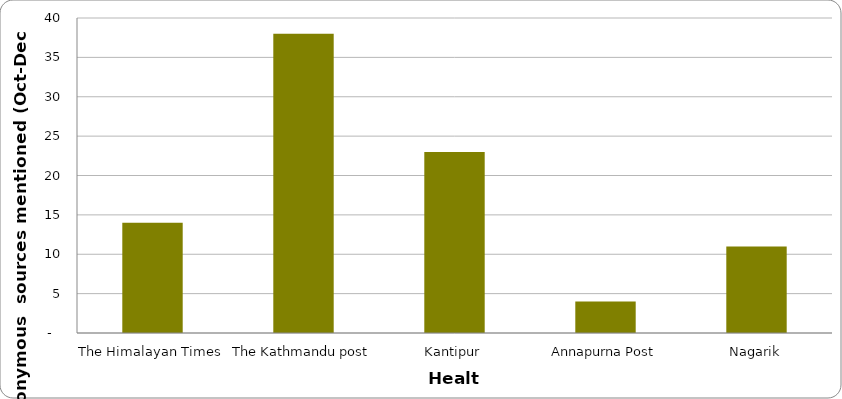
| Category | Health |
|---|---|
| The Himalayan Times | 14 |
| The Kathmandu post | 38 |
| Kantipur | 23 |
| Annapurna Post | 4 |
| Nagarik | 11 |